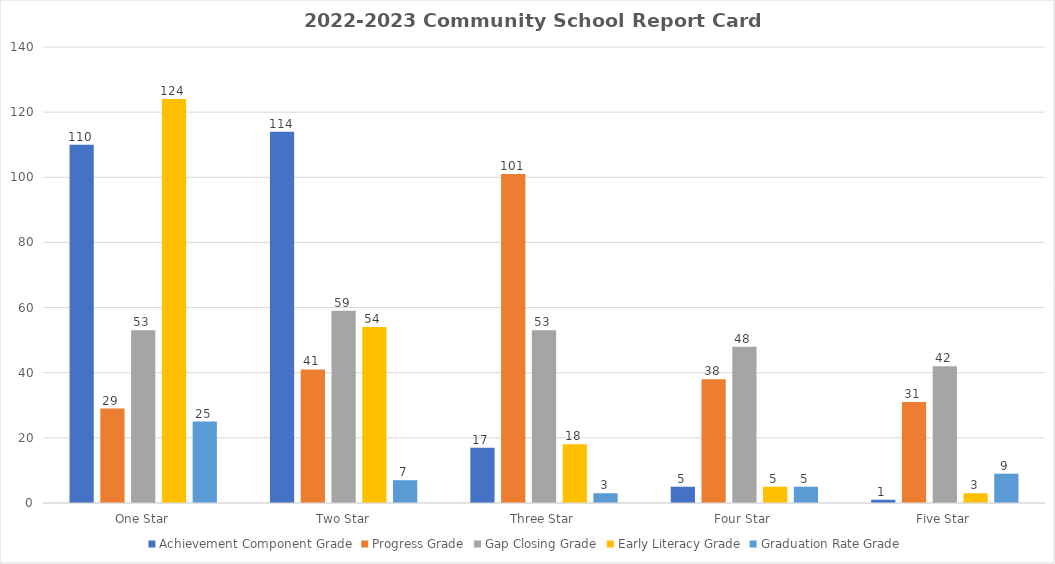
| Category | Achievement Component Grade | Progress Grade | Gap Closing Grade | Early Literacy Grade | Graduation Rate Grade |
|---|---|---|---|---|---|
| One Star | 110 | 29 | 53 | 124 | 25 |
| Two Star | 114 | 41 | 59 | 54 | 7 |
| Three Star | 17 | 101 | 53 | 18 | 3 |
| Four Star | 5 | 38 | 48 | 5 | 5 |
| Five Star | 1 | 31 | 42 | 3 | 9 |